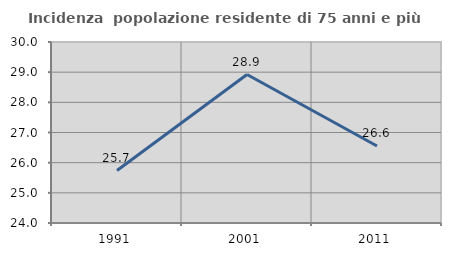
| Category | Incidenza  popolazione residente di 75 anni e più |
|---|---|
| 1991.0 | 25.738 |
| 2001.0 | 28.922 |
| 2011.0 | 26.554 |